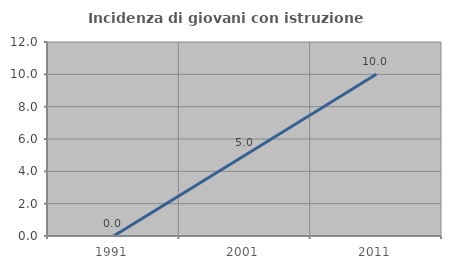
| Category | Incidenza di giovani con istruzione universitaria |
|---|---|
| 1991.0 | 0 |
| 2001.0 | 5 |
| 2011.0 | 10 |